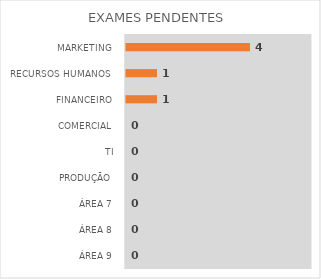
| Category | EXAMES PENDENTES |
|---|---|
| MARKETING | 4 |
| RECURSOS HUMANOS | 1 |
| FINANCEIRO | 1 |
| COMERCIAL | 0 |
| TI | 0 |
| PRODUÇÃO | 0 |
| ÁREA 7 | 0 |
| ÁREA 8 | 0 |
| ÁREA 9 | 0 |